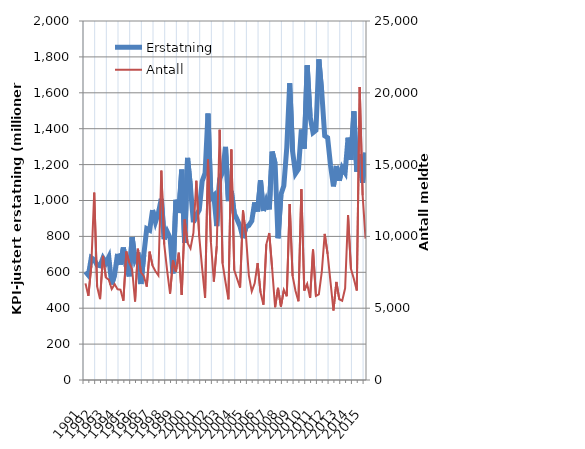
| Category | Erstatning |
|---|---|
| 1991.0 | 603.481 |
| nan | 583.801 |
| nan | 681.18 |
| nan | 669.603 |
| 1992.0 | 640.692 |
| nan | 636.6 |
| nan | 679.715 |
| nan | 652.46 |
| 1993.0 | 685.11 |
| nan | 532.071 |
| nan | 587.038 |
| nan | 702.553 |
| 1994.0 | 643.28 |
| nan | 737.946 |
| nan | 632.475 |
| nan | 577.464 |
| 1995.0 | 795.896 |
| nan | 672.716 |
| nan | 709.814 |
| nan | 535.299 |
| 1996.0 | 697.434 |
| nan | 842.561 |
| nan | 834.158 |
| nan | 946.501 |
| 1997.0 | 880.353 |
| nan | 930.976 |
| nan | 1009.305 |
| nan | 784.671 |
| 1998.0 | 826.639 |
| nan | 792.153 |
| nan | 593.691 |
| nan | 1004.115 |
| 1999.0 | 930.353 |
| nan | 1171.553 |
| nan | 763.248 |
| nan | 1237.391 |
| 2000.0 | 1073.081 |
| nan | 878.192 |
| nan | 918.127 |
| nan | 947.533 |
| 2001.0 | 1107.577 |
| nan | 1152.908 |
| nan | 1484.498 |
| nan | 1011.7 |
| 2002.0 | 1027.564 |
| nan | 857.616 |
| nan | 1119.058 |
| nan | 1157.483 |
| 2003.0 | 1298.758 |
| nan | 996.944 |
| nan | 1052.381 |
| nan | 926.811 |
| 2004.0 | 893.862 |
| nan | 855.082 |
| nan | 790.749 |
| nan | 851.902 |
| 2005.0 | 861.134 |
| nan | 885.928 |
| nan | 989.7 |
| nan | 939.181 |
| 2006.0 | 1112.107 |
| nan | 941.928 |
| nan | 998.915 |
| nan | 950.247 |
| 2007.0 | 1272.529 |
| nan | 1205.484 |
| nan | 789.79 |
| nan | 1033.21 |
| 2008.0 | 1082.173 |
| nan | 1294.715 |
| nan | 1653.143 |
| nan | 1273.488 |
| 2009.0 | 1149.85 |
| nan | 1173.942 |
| nan | 1395.31 |
| nan | 1289.196 |
| 2010.0 | 1753.533 |
| nan | 1467.453 |
| nan | 1377.784 |
| nan | 1391.074 |
| 2011.0 | 1786.114 |
| nan | 1602.462 |
| nan | 1359.902 |
| nan | 1349.973 |
| 2012.0 | 1195.733 |
| nan | 1078.773 |
| nan | 1192.147 |
| nan | 1110.769 |
| 2013.0 | 1181.853 |
| nan | 1155.655 |
| nan | 1350.015 |
| nan | 1227.003 |
| 2014.0 | 1496.943 |
| nan | 1160.463 |
| nan | 1258.954 |
| nan | 1098.824 |
| 2015.0 | 1265.965 |